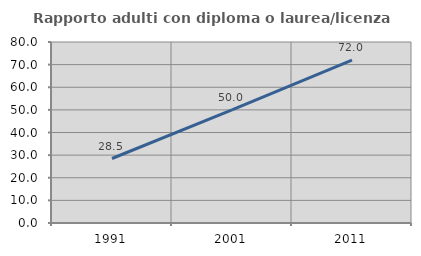
| Category | Rapporto adulti con diploma o laurea/licenza media  |
|---|---|
| 1991.0 | 28.505 |
| 2001.0 | 50 |
| 2011.0 | 72.01 |